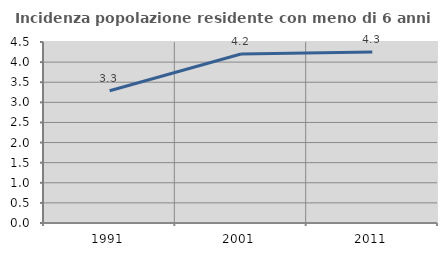
| Category | Incidenza popolazione residente con meno di 6 anni |
|---|---|
| 1991.0 | 3.289 |
| 2001.0 | 4.203 |
| 2011.0 | 4.251 |